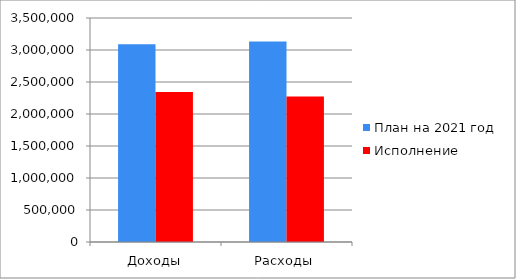
| Category | План на 2021 год | Исполнение |
|---|---|---|
| Доходы | 3091341 | 2342216.24 |
| Расходы | 3132168 | 2273302.07 |